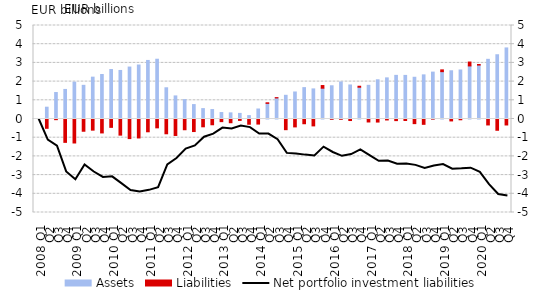
| Category | Assets | Liabilities |
|---|---|---|
| 2008 Q1 | 0 | 0 |
| Q2 | 0.631 | -0.498 |
| Q3 | 1.415 | -0.036 |
| Q4 | 1.581 | -1.249 |
| 2009 Q1 | 1.969 | -1.283 |
| Q2 | 1.8 | -0.655 |
| Q3 | 2.238 | -0.596 |
| Q4 | 2.378 | -0.745 |
| 2010 Q1 | 2.646 | -0.447 |
| Q2 | 2.595 | -0.863 |
| Q3 | 2.778 | -1.048 |
| Q4 | 2.887 | -1.014 |
| 2011 Q1 | 3.131 | -0.684 |
| Q2 | 3.196 | -0.473 |
| Q3 | 1.669 | -0.79 |
| Q4 | 1.235 | -0.881 |
| 2012 Q1 | 1.037 | -0.575 |
| Q2 | 0.771 | -0.671 |
| Q3 | 0.556 | -0.417 |
| Q4 | 0.505 | -0.308 |
| 2013 Q1 | 0.346 | -0.141 |
| Q2 | 0.328 | -0.2 |
| Q3 | 0.299 | -0.075 |
| Q4 | 0.181 | -0.281 |
| 2014 Q1 | 0.534 | -0.271 |
| Q2 | 0.835 | 0.031 |
| Q3 | 1.126 | 0.016 |
| Q4 | 1.267 | -0.571 |
| 2015 Q1 | 1.445 | -0.423 |
| Q2 | 1.678 | -0.254 |
| Q3 | 1.609 | -0.369 |
| Q4 | 1.647 | 0.142 |
| 2016 Q1 | 1.776 | -0.014 |
| Q2 | 1.981 | -0.014 |
| Q3 | 1.819 | -0.082 |
| Q4 | 1.699 | 0.052 |
| 2017 Q1 | 1.801 | -0.159 |
| Q2 | 2.097 | -0.164 |
| Q3 | 2.2 | -0.052 |
| Q4 | 2.333 | -0.087 |
| 2018 Q1 | 2.331 | -0.079 |
| Q2 | 2.232 | -0.248 |
| Q3 | 2.36 | -0.285 |
| Q4 | 2.507 | -0.003 |
| 2019 Q1 | 2.532 | 0.095 |
| Q2 | 2.579 | -0.103 |
| Q3 | 2.621 | -0.042 |
| Q4 | 2.838 | 0.207 |
| 2020 Q1 | 2.883 | 0.033 |
| Q2 | 3.191 | -0.319 |
| Q3 | 3.436 | -0.603 |
| Q4 | 3.8 | -0.32 |